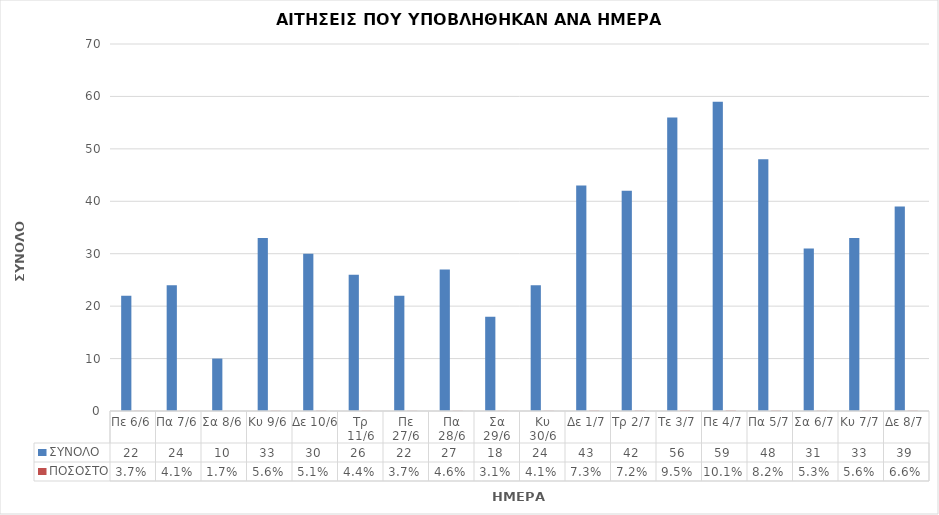
| Category | ΣΥΝΟΛΟ | ΠΟΣΟΣΤΟ |
|---|---|---|
| Πε 6/6 | 22 | 0.037 |
| Πα 7/6 | 24 | 0.041 |
| Σα 8/6 | 10 | 0.017 |
| Κυ 9/6 | 33 | 0.056 |
| Δε 10/6 | 30 | 0.051 |
| Τρ 11/6 | 26 | 0.044 |
| Πε 27/6 | 22 | 0.037 |
| Πα 28/6 | 27 | 0.046 |
| Σα 29/6 | 18 | 0.031 |
| Κυ 30/6 | 24 | 0.041 |
| Δε 1/7 | 43 | 0.073 |
| Τρ 2/7 | 42 | 0.072 |
| Τε 3/7 | 56 | 0.095 |
| Πε 4/7 | 59 | 0.101 |
| Πα 5/7 | 48 | 0.082 |
| Σα 6/7 | 31 | 0.053 |
| Κυ 7/7 | 33 | 0.056 |
| Δε 8/7 | 39 | 0.066 |